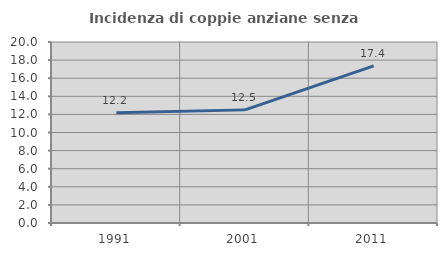
| Category | Incidenza di coppie anziane senza figli  |
|---|---|
| 1991.0 | 12.195 |
| 2001.0 | 12.5 |
| 2011.0 | 17.361 |